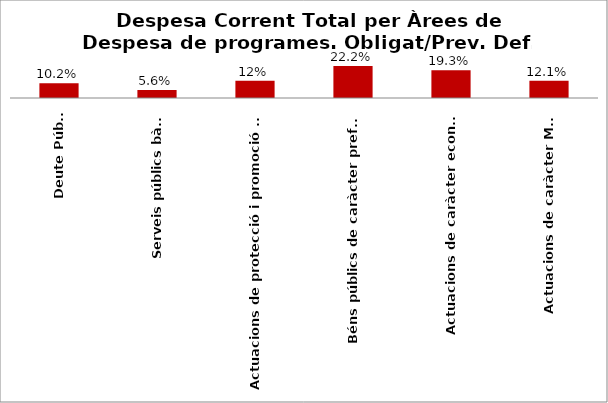
| Category | Series 0 |
|---|---|
| Deute Públic | 0.102 |
| Serveis públics bàsics | 0.056 |
| Actuacions de protecció i promoció social | 0.12 |
| Béns públics de caràcter preferent | 0.222 |
| Actuacions de caràcter econòmic | 0.193 |
| Actuacions de caràcter Marçal | 0.121 |